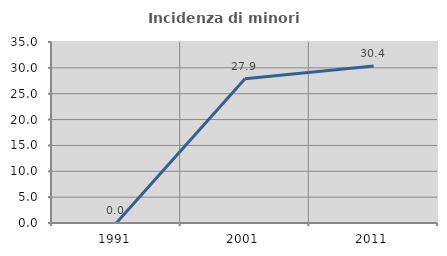
| Category | Incidenza di minori stranieri |
|---|---|
| 1991.0 | 0 |
| 2001.0 | 27.907 |
| 2011.0 | 30.38 |